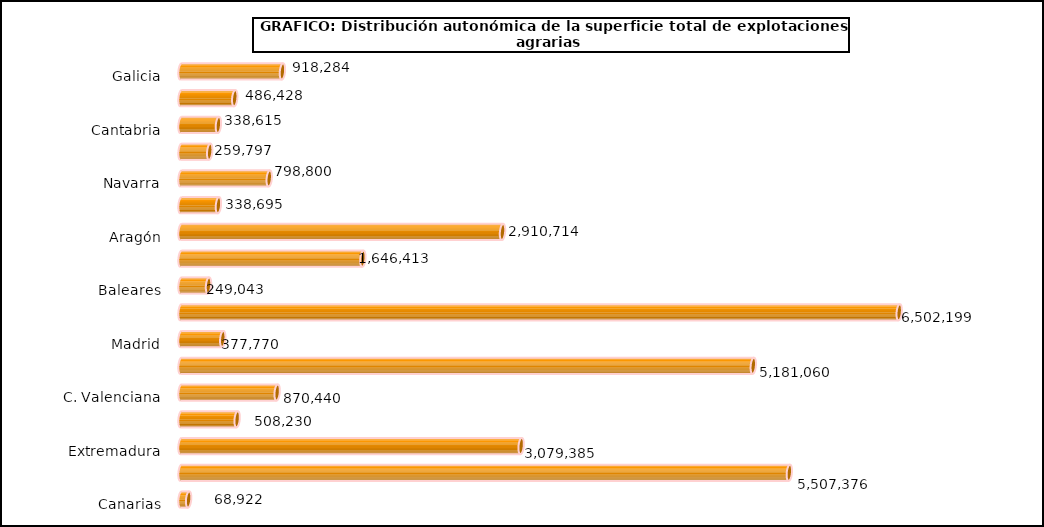
| Category | superficie |
|---|---|
|   Galicia | 918284 |
|   P. de Asturias | 486428 |
|   Cantabria | 338615 |
|   País Vasco | 259797 |
|   Navarra | 798800 |
|   La Rioja | 338695 |
|   Aragón | 2910714 |
|   Cataluña | 1646413 |
|   Baleares | 249043 |
|   Castilla y León | 6502199 |
|   Madrid | 377770 |
|   Castilla-La Mancha | 5181060 |
|   C. Valenciana | 870440 |
|   R. de Murcia | 508230 |
|   Extremadura | 3079385 |
|   Andalucía | 5507376 |
|   Canarias | 68922 |